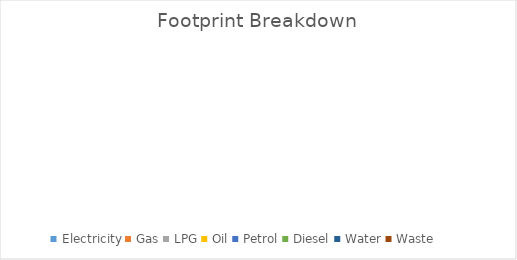
| Category | Series 0 |
|---|---|
| Electricity | 0 |
| Gas | 0 |
| LPG | 0 |
| Oil | 0 |
| Petrol | 0 |
| Diesel | 0 |
| Water | 0 |
| Waste | 0 |